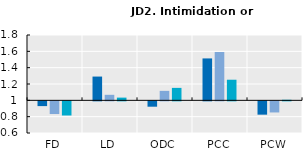
| Category | 2005 | 2010 | 2015 |
|---|---|---|---|
| FD | 0.942 | 0.844 | 0.827 |
| LD | 1.291 | 1.068 | 1.033 |
| ODC | 0.934 | 1.116 | 1.152 |
| PCC | 1.513 | 1.592 | 1.252 |
| PCW | 0.837 | 0.864 | 1.007 |